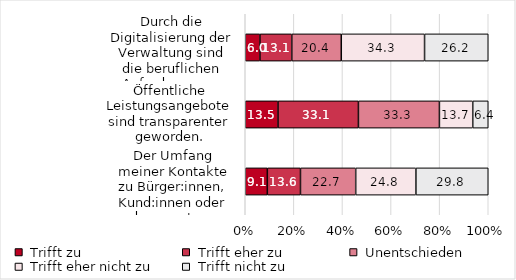
| Category | Series 0 | Series 1 | Series 2 | Series 3 | Series 4 |
|---|---|---|---|---|---|
| Durch die Digitalisierung der Verwaltung sind die beruflichen Anforderungen nicht gestiegen. | 6.048 | 13.105 | 20.363 | 34.274 | 26.21 |
| Öffentliche Leistungsangebote sind transparenter geworden. | 13.475 | 33.097 | 33.333 | 13.712 | 6.383 |
| Der Umfang meiner Kontakte zu Bürger:innen, Kund:innen oder anderen externen Personen hat abgenommen. | 9.091 | 13.636 | 22.727 | 24.773 | 29.773 |